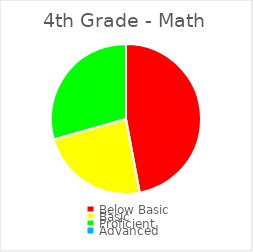
| Category | Series 0 |
|---|---|
| Below Basic | 0.471 |
| Basic | 0.235 |
| Proficient | 0.294 |
| Advanced | 0 |